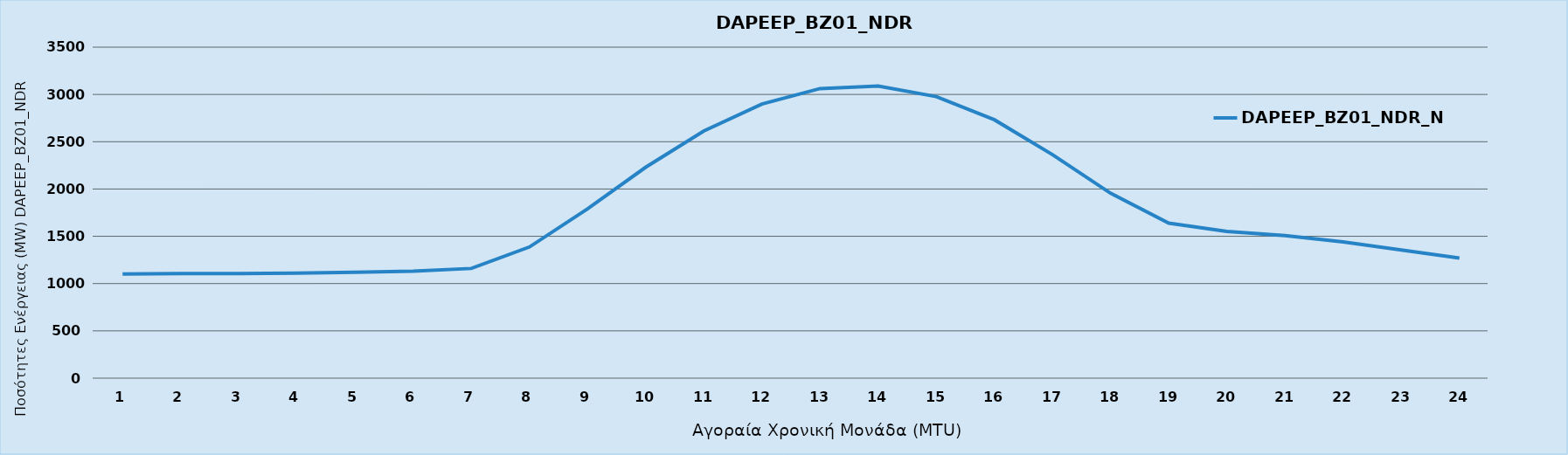
| Category | DAPEEP_BZ01_NDR_N1 |
|---|---|
| 0 | 1101 |
| 1 | 1107 |
| 2 | 1105 |
| 3 | 1110 |
| 4 | 1120 |
| 5 | 1131 |
| 6 | 1160 |
| 7 | 1387 |
| 8 | 1790 |
| 9 | 2230 |
| 10 | 2613 |
| 11 | 2899 |
| 12 | 3062 |
| 13 | 3089 |
| 14 | 2977 |
| 15 | 2732 |
| 16 | 2363 |
| 17 | 1955 |
| 18 | 1639 |
| 19 | 1551 |
| 20 | 1507 |
| 21 | 1440 |
| 22 | 1355 |
| 23 | 1270 |